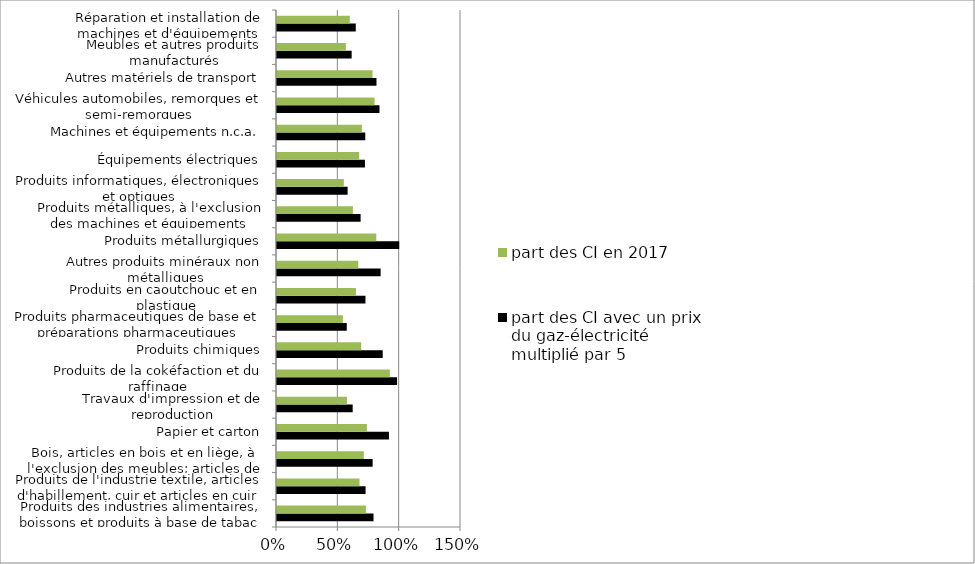
| Category | part des CI avec un prix du gaz-électricité multiplié par 5 | part des CI en 2017 |
|---|---|---|
| Produits des industries alimentaires, boissons et produits à base de tabac | 0.787 | 0.725 |
| Produits de l'industrie textile, articles d'habillement, cuir et articles en cuir | 0.722 | 0.673 |
| Bois, articles en bois et en liège, à l'exclusion des meubles; articles de vannerie et de sparterie | 0.78 | 0.707 |
| Papier et carton | 0.913 | 0.733 |
| Travaux d'impression et de reproduction | 0.617 | 0.57 |
| Produits de la cokéfaction et du raffinage | 0.979 | 0.92 |
| Produits chimiques | 0.862 | 0.686 |
| Produits pharmaceutiques de base et préparations pharmaceutiques | 0.569 | 0.537 |
| Produits en caoutchouc et en plastique | 0.721 | 0.644 |
| Autres produits minéraux non métalliques | 0.845 | 0.663 |
| Produits métallurgiques | 0.997 | 0.809 |
| Produits métalliques, à l'exclusion des machines et équipements | 0.682 | 0.619 |
| Produits informatiques, électroniques et optiques | 0.576 | 0.545 |
| Équipements électriques | 0.717 | 0.67 |
| Machines et équipements n.c.a. | 0.72 | 0.692 |
| Véhicules automobiles, remorques et semi-remorques | 0.835 | 0.795 |
| Autres matériels de transport | 0.811 | 0.779 |
| Meubles et autres produits manufacturés | 0.609 | 0.562 |
| Réparation et installation de machines et d'équipements | 0.642 | 0.593 |